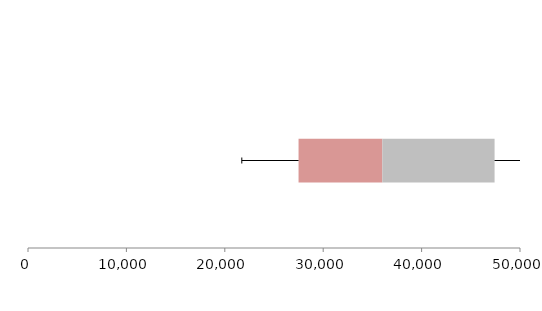
| Category | Series 1 | Series 2 | Series 3 |
|---|---|---|---|
| 0 | 27495.474 | 8514.627 | 11405.885 |